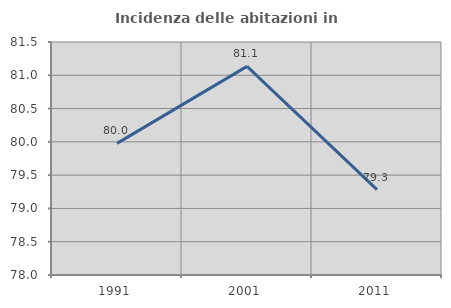
| Category | Incidenza delle abitazioni in proprietà  |
|---|---|
| 1991.0 | 79.977 |
| 2001.0 | 81.134 |
| 2011.0 | 79.283 |